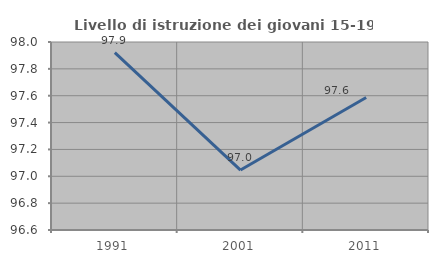
| Category | Livello di istruzione dei giovani 15-19 anni |
|---|---|
| 1991.0 | 97.921 |
| 2001.0 | 97.046 |
| 2011.0 | 97.586 |